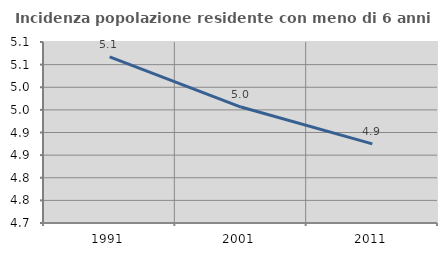
| Category | Incidenza popolazione residente con meno di 6 anni |
|---|---|
| 1991.0 | 5.067 |
| 2001.0 | 4.956 |
| 2011.0 | 4.875 |